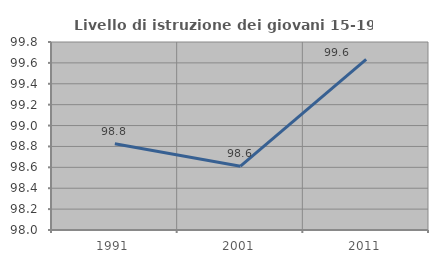
| Category | Livello di istruzione dei giovani 15-19 anni |
|---|---|
| 1991.0 | 98.826 |
| 2001.0 | 98.611 |
| 2011.0 | 99.634 |